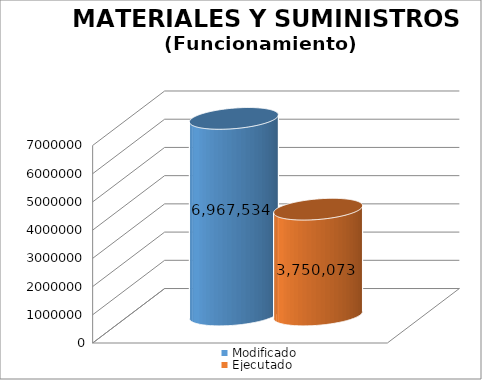
| Category | Modificado | Ejecutado |
|---|---|---|
| 0 | 6967534 | 3750073.19 |